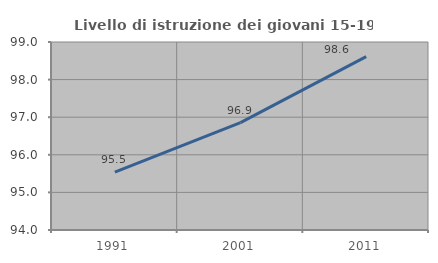
| Category | Livello di istruzione dei giovani 15-19 anni |
|---|---|
| 1991.0 | 95.541 |
| 2001.0 | 96.855 |
| 2011.0 | 98.613 |